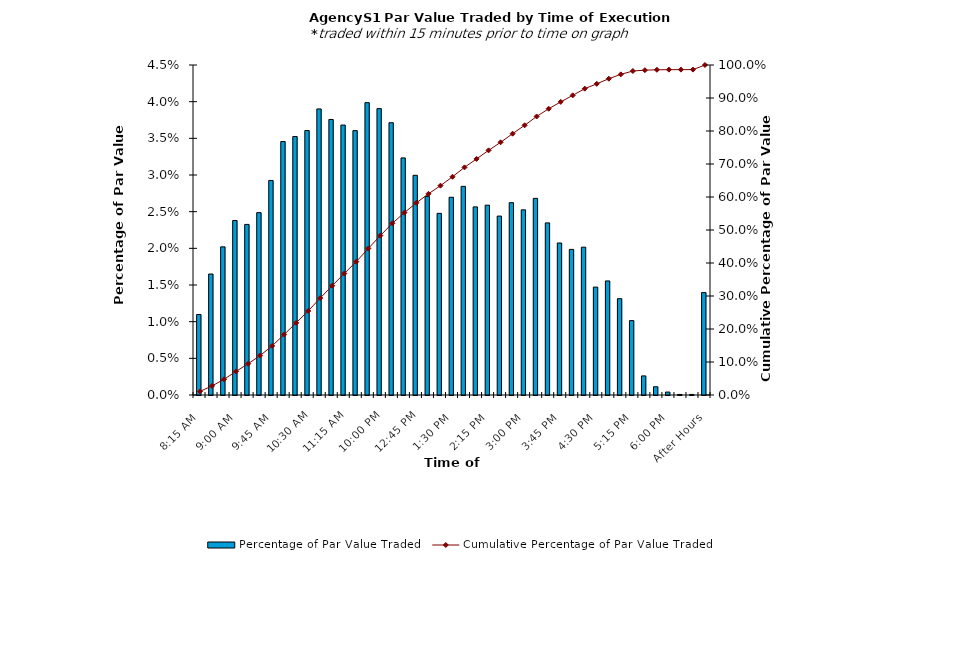
| Category | Percentage of Par Value Traded |
|---|---|
| 8:15 AM | 0.011 |
| 8:30 AM | 0.016 |
| 8:45 AM | 0.02 |
| 9:00 AM | 0.024 |
| 9:15 AM | 0.023 |
| 9:30 AM | 0.025 |
| 9:45 AM | 0.029 |
| 10:00 AM | 0.035 |
| 10:15 AM | 0.035 |
| 10:30 AM | 0.036 |
| 10:45 AM | 0.039 |
| 11:00 AM | 0.038 |
| 11:15 AM | 0.037 |
| 11:30 AM | 0.036 |
| 11:45 AM | 0.04 |
| 12:00 PM | 0.039 |
| 12:15 PM | 0.037 |
| 12:30 PM | 0.032 |
| 12:45 PM | 0.03 |
| 1:00 PM | 0.027 |
| 1:15 PM | 0.025 |
| 1:30 PM | 0.027 |
| 1:45 PM | 0.028 |
| 2:00 PM | 0.026 |
| 2:15 PM | 0.026 |
| 2:30 PM | 0.024 |
| 2:45 PM | 0.026 |
| 3:00 PM | 0.025 |
| 3:15 PM | 0.027 |
| 3:30 PM | 0.023 |
| 3:45 PM | 0.021 |
| 4:00 PM | 0.02 |
| 4:15 PM | 0.02 |
| 4:30 PM | 0.015 |
| 4:45 PM | 0.016 |
| 5:00 PM | 0.013 |
| 5:15 PM | 0.01 |
| 5:30 PM | 0.003 |
| 5:45 PM | 0.001 |
| 6:00 PM | 0 |
| 6:15 PM | 0 |
| 6:30 PM | 0 |
| After Hours | 0.014 |